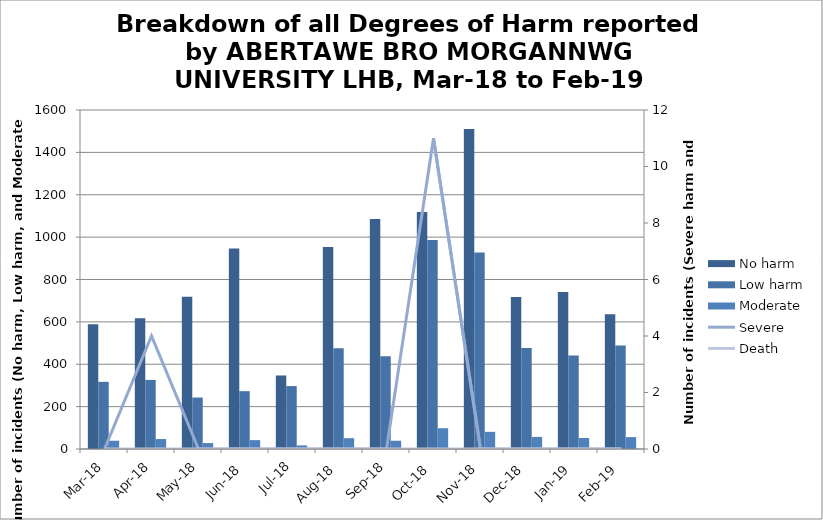
| Category | No harm | Low harm | Moderate |
|---|---|---|---|
| Mar-18 | 589 | 317 | 39 |
| Apr-18 | 617 | 326 | 47 |
| May-18 | 718 | 243 | 28 |
| Jun-18 | 946 | 273 | 42 |
| Jul-18 | 347 | 297 | 17 |
| Aug-18 | 953 | 475 | 51 |
| Sep-18 | 1085 | 438 | 39 |
| Oct-18 | 1119 | 986 | 98 |
| Nov-18 | 1510 | 928 | 81 |
| Dec-18 | 717 | 477 | 57 |
| Jan-19 | 741 | 441 | 52 |
| Feb-19 | 636 | 488 | 56 |